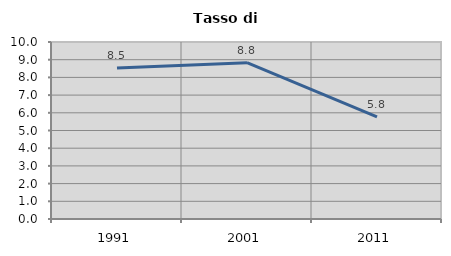
| Category | Tasso di disoccupazione   |
|---|---|
| 1991.0 | 8.525 |
| 2001.0 | 8.833 |
| 2011.0 | 5.769 |